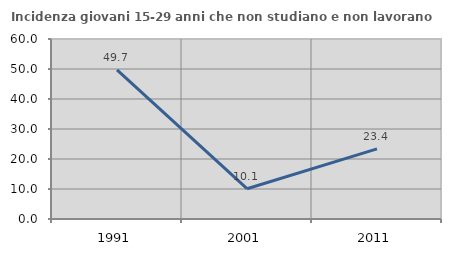
| Category | Incidenza giovani 15-29 anni che non studiano e non lavorano  |
|---|---|
| 1991.0 | 49.703 |
| 2001.0 | 10.092 |
| 2011.0 | 23.364 |